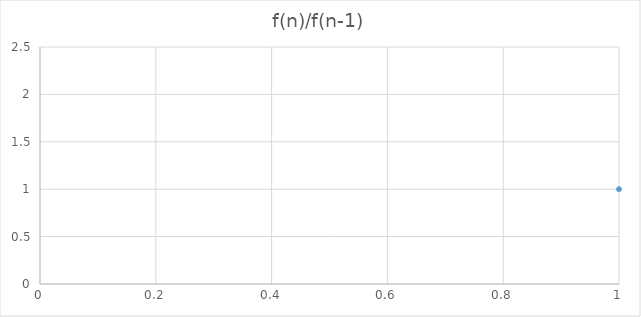
| Category | Series 0 |
|---|---|
| 0 | 1 |
| 1 | 2 |
| 2 | 1.5 |
| 3 | 1.667 |
| 4 | 1.6 |
| 5 | 1.625 |
| 6 | 1.615 |
| 7 | 1.619 |
| 8 | 1.618 |
| 9 | 1.618 |
| 10 | 1.618 |
| 11 | 1.618 |
| 12 | 1.618 |
| 13 | 1.618 |
| 14 | 1.618 |
| 15 | 1.618 |
| 16 | 1.618 |
| 17 | 1.618 |
| 18 | 1.618 |
| 19 | 1.618 |
| 20 | 1.618 |
| 21 | 1.618 |
| 22 | 1.618 |
| 23 | 1.618 |
| 24 | 1.618 |
| 25 | 1.618 |
| 26 | 1.618 |
| 27 | 1.618 |
| 28 | 1.618 |
| 29 | 1.618 |
| 30 | 1.618 |
| 31 | 1.618 |
| 32 | 1.618 |
| 33 | 1.618 |
| 34 | 1.618 |
| 35 | 1.618 |
| 36 | 1.618 |
| 37 | 1.618 |
| 38 | 1.618 |
| 39 | 1.618 |
| 40 | 1.618 |
| 41 | 1.618 |
| 42 | 1.618 |
| 43 | 1.618 |
| 44 | 1.618 |
| 45 | 1.618 |
| 46 | 1.618 |
| 47 | 1.618 |
| 48 | 1.618 |
| 49 | 1.618 |
| 50 | 1.618 |
| 51 | 1.618 |
| 52 | 1.618 |
| 53 | 1.618 |
| 54 | 1.618 |
| 55 | 1.618 |
| 56 | 1.618 |
| 57 | 1.618 |
| 58 | 1.618 |
| 59 | 1.618 |
| 60 | 1.618 |
| 61 | 1.618 |
| 62 | 1.618 |
| 63 | 1.618 |
| 64 | 1.618 |
| 65 | 1.618 |
| 66 | 1.618 |
| 67 | 1.618 |
| 68 | 1.618 |
| 69 | 1.618 |
| 70 | 1.618 |
| 71 | 1.618 |
| 72 | 1.618 |
| 73 | 1.618 |
| 74 | 1.618 |
| 75 | 1.618 |
| 76 | 1.618 |
| 77 | 1.618 |
| 78 | 1.618 |
| 79 | 1.618 |
| 80 | 1.618 |
| 81 | 1.618 |
| 82 | 1.618 |
| 83 | 1.618 |
| 84 | 1.618 |
| 85 | 1.618 |
| 86 | 1.618 |
| 87 | 1.618 |
| 88 | 1.618 |
| 89 | 1.618 |
| 90 | 1.618 |
| 91 | 1.618 |
| 92 | 1.618 |
| 93 | 1.618 |
| 94 | 1.618 |
| 95 | 1.618 |
| 96 | 1.618 |
| 97 | 1.618 |
| 98 | 1.618 |